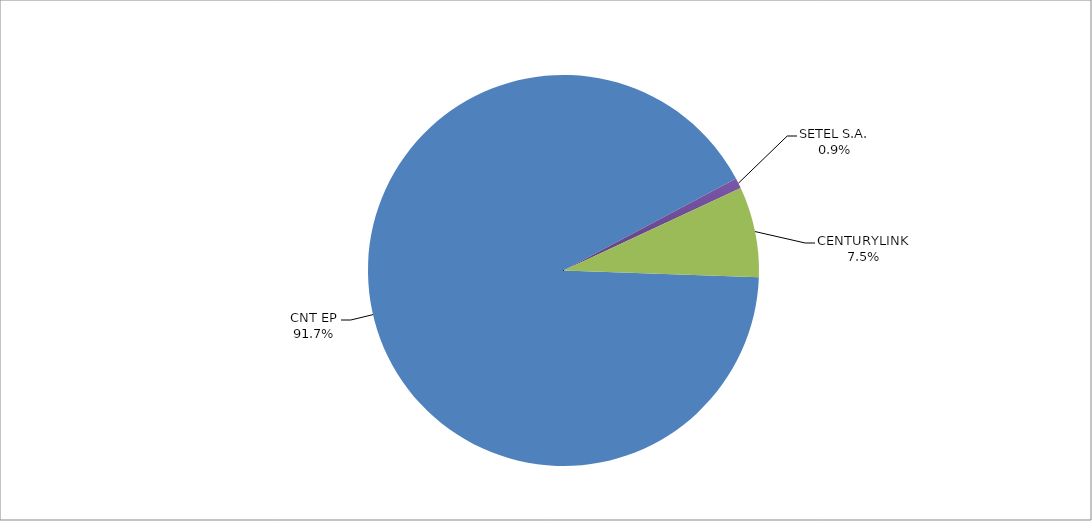
| Category | Series 0 |
|---|---|
| CNT EP | 318 |
| SETEL S.A. | 3 |
| CENTURYLINK | 26 |